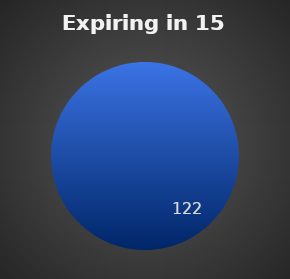
| Category | Expiring in 15 Days |
|---|---|
| 0 | 122 |